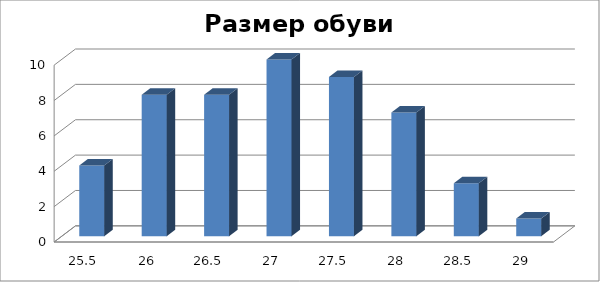
| Category | Series 0 |
|---|---|
| 25.5 | 4 |
| 26.0 | 8 |
| 26.5 | 8 |
| 27.0 | 10 |
| 27.5 | 9 |
| 28.0 | 7 |
| 28.5 | 3 |
| 29.0 | 1 |